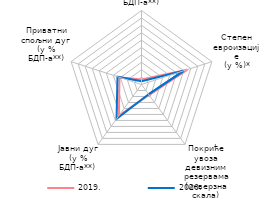
| Category | 2019. | 2020. |
|---|---|---|
| Текући дефицит платног биланса
(у % БДП-a**) | 6.9 | 4.3 |
| Степен
евроизације
(у %)* | 64.9 | 59.9 |
| Покриће увоза девизним резервама
(инверзна скала) | 17.4 | 16.3 |
| Јавни дуг
(у % БДП-a**) | 52 | 57.4 |
| Приватни
спољни дуг
(у % БДП-a**) | 31.3 | 34.1 |